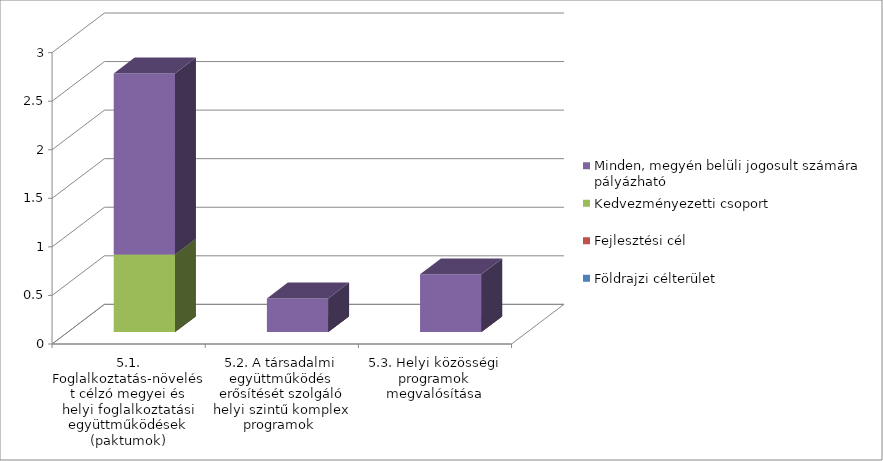
| Category | Földrajzi célterület  | Fejlesztési cél  | Kedvezményezetti csoport | Minden, megyén belüli jogosult számára pályázható   |
|---|---|---|---|---|
| 5.1. Foglalkoztatás-növelést célzó megyei és helyi foglalkoztatási együttműködések (paktumok) | 0 | 0 | 0.799 | 1.864 |
| 5.2. A társadalmi együttműködés erősítését szolgáló helyi szintű komplex programok  | 0 | 0 | 0 | 0.347 |
| 5.3. Helyi közösségi programok megvalósítása | 0 | 0 | 0 | 0.595 |